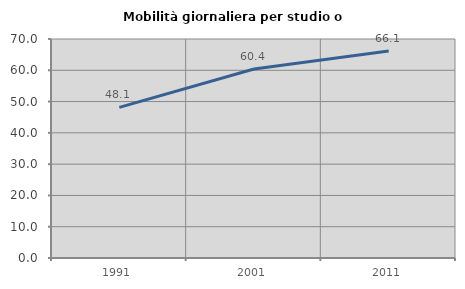
| Category | Mobilità giornaliera per studio o lavoro |
|---|---|
| 1991.0 | 48.127 |
| 2001.0 | 60.41 |
| 2011.0 | 66.137 |